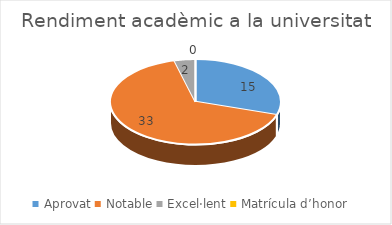
| Category | Series 0 |
|---|---|
| Aprovat | 15 |
| Notable | 33 |
| Excel·lent | 2 |
| Matrícula d’honor | 0 |